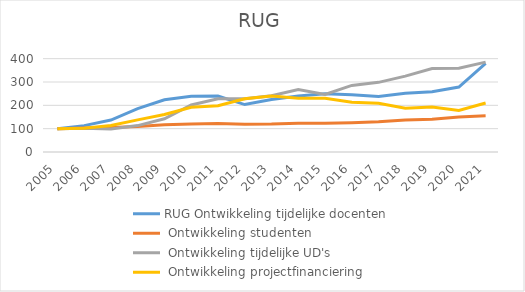
| Category | RUG |
|---|---|
| 2005.0 | 100 |
| 2006.0 | 102.313 |
| 2007.0 | 113.236 |
| 2008.0 | 137.719 |
| 2009.0 | 160.484 |
| 2010.0 | 191.391 |
| 2011.0 | 198.213 |
| 2012.0 | 228.209 |
| 2013.0 | 240.174 |
| 2014.0 | 230.37 |
| 2015.0 | 230.45 |
| 2016.0 | 213.138 |
| 2017.0 | 209.006 |
| 2018.0 | 187.611 |
| 2019.0 | 192.567 |
| 2020.0 | 178.163 |
| 2021.0 | 209.855 |